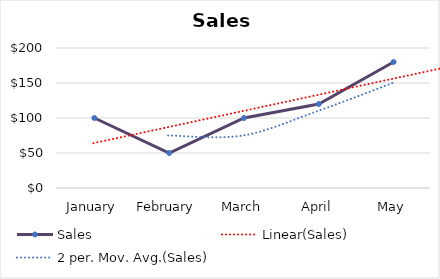
| Category | Sales |
|---|---|
| January | 100 |
| February | 50 |
| March | 100 |
| April | 120 |
| May | 180 |